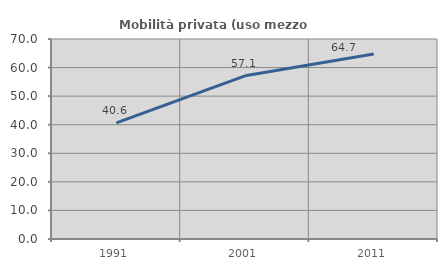
| Category | Mobilità privata (uso mezzo privato) |
|---|---|
| 1991.0 | 40.625 |
| 2001.0 | 57.104 |
| 2011.0 | 64.722 |